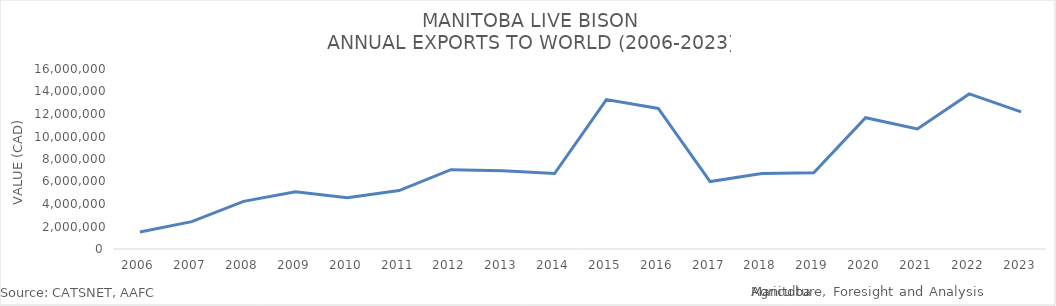
| Category | Series 0 |
|---|---|
| 2006 | 1508666 |
| 2007 | 2430720 |
| 2008 | 4232272 |
| 2009 | 5087321 |
| 2010 | 4548081 |
| 2011 | 5195558 |
| 2012 | 7050200 |
| 2013 | 6964087 |
| 2014 | 6707854 |
| 2015 | 13277735 |
| 2016 | 12497612 |
| 2017 | 5990814 |
| 2018 | 6720514 |
| 2019 | 6774640 |
| 2020 | 11665598 |
| 2021 | 10671712 |
| 2022 | 13784011 |
| 2023 | 12189214 |